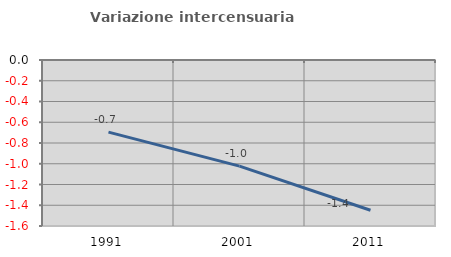
| Category | Variazione intercensuaria annua |
|---|---|
| 1991.0 | -0.695 |
| 2001.0 | -1.023 |
| 2011.0 | -1.448 |